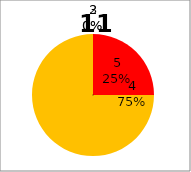
| Category | Series 0 |
|---|---|
| 5.0 | 3 |
| 4.0 | 9 |
| 3.0 | 0 |
| 2.0 | 0 |